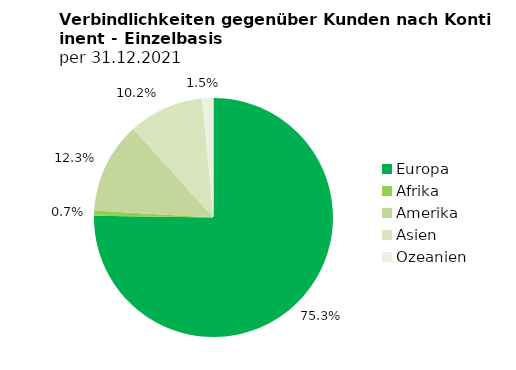
| Category | Series 0 |
|---|---|
| Europa | 35793284 |
| Afrika | 324500 |
| Amerika | 5865354 |
| Asien | 4856070 |
| Ozeanien | 728430 |